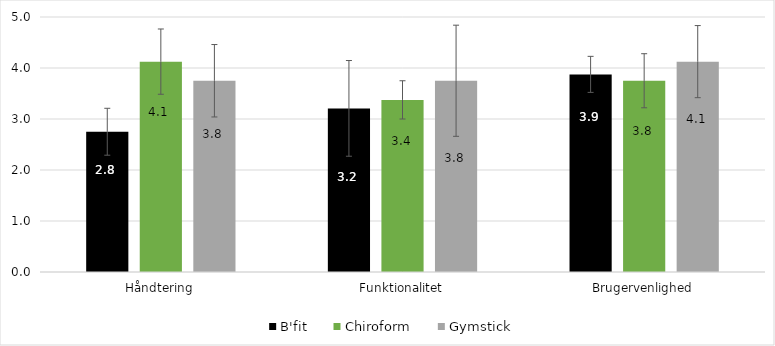
| Category | B'fit | Chiroform | Gymstick |
|---|---|---|---|
| Håndtering | 2.75 | 4.125 | 3.75 |
| Funktionalitet | 3.208 | 3.375 | 3.75 |
| Brugervenlighed | 3.875 | 3.75 | 4.125 |